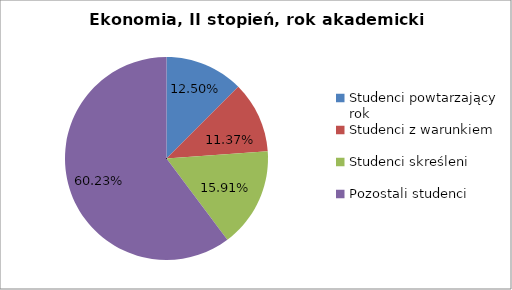
| Category | Series 0 |
|---|---|
| Studenci powtarzający rok | 11 |
| Studenci z warunkiem | 10 |
| Studenci skreśleni | 14 |
| Pozostali studenci | 53 |